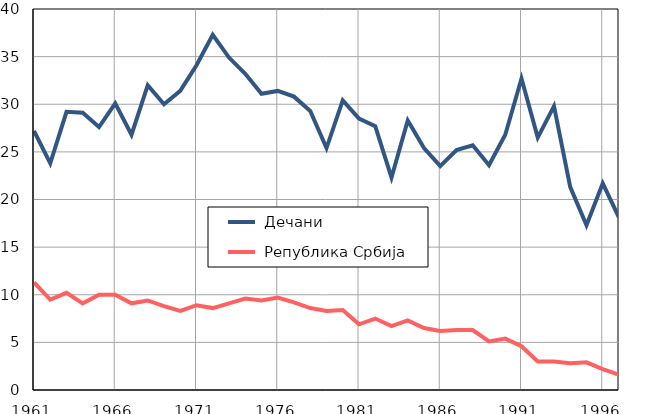
| Category |  Дечани |  Република Србија |
|---|---|---|
| 1961.0 | 27.2 | 11.3 |
| 1962.0 | 23.8 | 9.5 |
| 1963.0 | 29.2 | 10.2 |
| 1964.0 | 29.1 | 9.1 |
| 1965.0 | 27.6 | 10 |
| 1966.0 | 30.1 | 10 |
| 1967.0 | 26.8 | 9.1 |
| 1968.0 | 32 | 9.4 |
| 1969.0 | 30 | 8.8 |
| 1970.0 | 31.4 | 8.3 |
| 1971.0 | 34.1 | 8.9 |
| 1972.0 | 37.3 | 8.6 |
| 1973.0 | 34.9 | 9.1 |
| 1974.0 | 33.2 | 9.6 |
| 1975.0 | 31.1 | 9.4 |
| 1976.0 | 31.4 | 9.7 |
| 1977.0 | 30.8 | 9.2 |
| 1978.0 | 29.3 | 8.6 |
| 1979.0 | 25.4 | 8.3 |
| 1980.0 | 30.4 | 8.4 |
| 1981.0 | 28.5 | 6.9 |
| 1982.0 | 27.7 | 7.5 |
| 1983.0 | 22.3 | 6.7 |
| 1984.0 | 28.3 | 7.3 |
| 1985.0 | 25.4 | 6.5 |
| 1986.0 | 23.5 | 6.2 |
| 1987.0 | 25.2 | 6.3 |
| 1988.0 | 25.7 | 6.3 |
| 1989.0 | 23.6 | 5.1 |
| 1990.0 | 26.8 | 5.4 |
| 1991.0 | 32.7 | 4.6 |
| 1992.0 | 26.5 | 3 |
| 1993.0 | 29.8 | 3 |
| 1994.0 | 21.3 | 2.8 |
| 1995.0 | 17.3 | 2.9 |
| 1996.0 | 21.7 | 2.2 |
| 1997.0 | 18.1 | 1.6 |